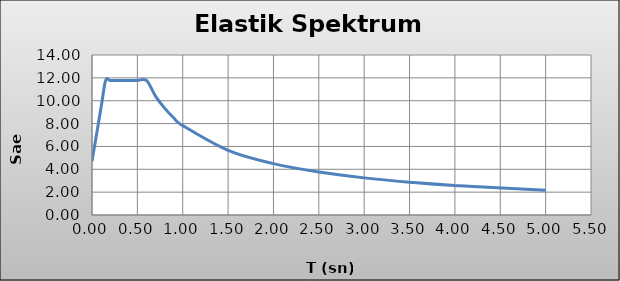
| Category | Series 0 |
|---|---|
| 0.0 | 4.709 |
| 0.1 | 9.418 |
| 0.15 | 11.772 |
| 0.2 | 11.772 |
| 0.3 | 11.772 |
| 0.4 | 11.772 |
| 0.5 | 11.772 |
| 0.6 | 11.772 |
| 0.7 | 10.406 |
| 0.8 | 9.352 |
| 0.9 | 8.511 |
| 1.0 | 7.823 |
| 1.5 | 5.656 |
| 2.0 | 4.493 |
| 2.5 | 3.759 |
| 3.0 | 3.248 |
| 3.5 | 2.872 |
| 4.0 | 2.581 |
| 5.0 | 2.159 |